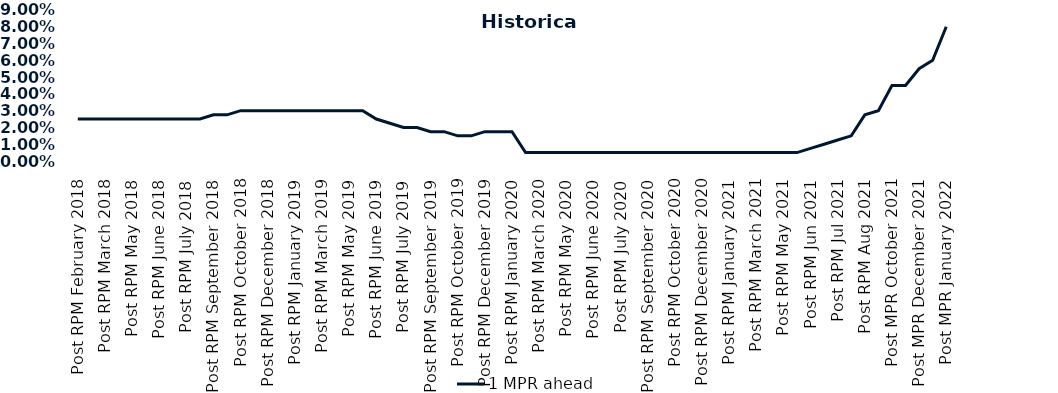
| Category | 1 MPR ahead |
|---|---|
| Post RPM February 2018 | 0.025 |
| Pre RPM March 2018 | 0.025 |
| Post RPM March 2018 | 0.025 |
| Pre RPM May 2018 | 0.025 |
| Post RPM May 2018 | 0.025 |
| Pre RPM June 2018 | 0.025 |
| Post RPM June 2018 | 0.025 |
| Pre RPM July 2018 | 0.025 |
| Post RPM July 2018 | 0.025 |
| Pre RPM September 2018 | 0.025 |
| Post RPM September 2018 | 0.028 |
| Pre RPM October 2018 | 0.028 |
| Post RPM October 2018 | 0.03 |
| Pre RPM December 2018 | 0.03 |
| Post RPM December 2018 | 0.03 |
| Pre RPM January 2019 | 0.03 |
| Post RPM January 2019 | 0.03 |
| Pre RPM March 2019 | 0.03 |
| Post RPM March 2019 | 0.03 |
| Pre RPM May 2019 | 0.03 |
| Post RPM May 2019 | 0.03 |
| Pre RPM June 2019 | 0.03 |
| Post RPM June 2019 | 0.025 |
| Pre RPM July 2019 | 0.022 |
| Post RPM July 2019 | 0.02 |
| Pre RPM September 2019 | 0.02 |
| Post RPM September 2019 | 0.018 |
| Pre RPM October 2019 | 0.018 |
| Post RPM October 2019 | 0.015 |
| Pre RPM December 2019 | 0.015 |
| Post RPM December 2019 | 0.018 |
| Pre RPM January 2020 | 0.018 |
| Post RPM January 2020 | 0.018 |
| Pre RPM March 2020 | 0.005 |
| Post RPM March 2020 | 0.005 |
| Pre RPM May 2020 | 0.005 |
| Post RPM May 2020 | 0.005 |
| Pre RPM June 2020 | 0.005 |
| Post RPM June 2020 | 0.005 |
| Pre RPM July 2020 | 0.005 |
| Post RPM July 2020 | 0.005 |
| Pre RPM September 2020 | 0.005 |
| Post RPM September 2020 | 0.005 |
| Pre RPM October 2020 | 0.005 |
| Post RPM October 2020 | 0.005 |
| Pre RPM December 2020 | 0.005 |
|  Post RPM December 2020 | 0.005 |
| Pre RPM January 2021 | 0.005 |
| Post RPM January 2021 | 0.005 |
|  Pre RPM March 2021 | 0.005 |
|  Post RPM March 2021 | 0.005 |
|  Pre RPM May 2021 | 0.005 |
|  Post RPM May 2021 | 0.005 |
|  Pre RPM Jun 2021 | 0.005 |
|   Post RPM Jun 2021 | 0.008 |
| Pre RPM Jul 2021 | 0.01 |
|  Post RPM Jul 2021 | 0.012 |
| Pre RPM Aug 2021 | 0.015 |
|  Post RPM Aug 2021 | 0.028 |
| Pre MPR October 2021 | 0.03 |
| Post MPR October 2021 | 0.045 |
| Pre MPR December 2021 | 0.045 |
| Post MPR December 2021 | 0.055 |
| Pre MPR January 2022 | 0.06 |
| Post MPR January 2022 | 0.08 |